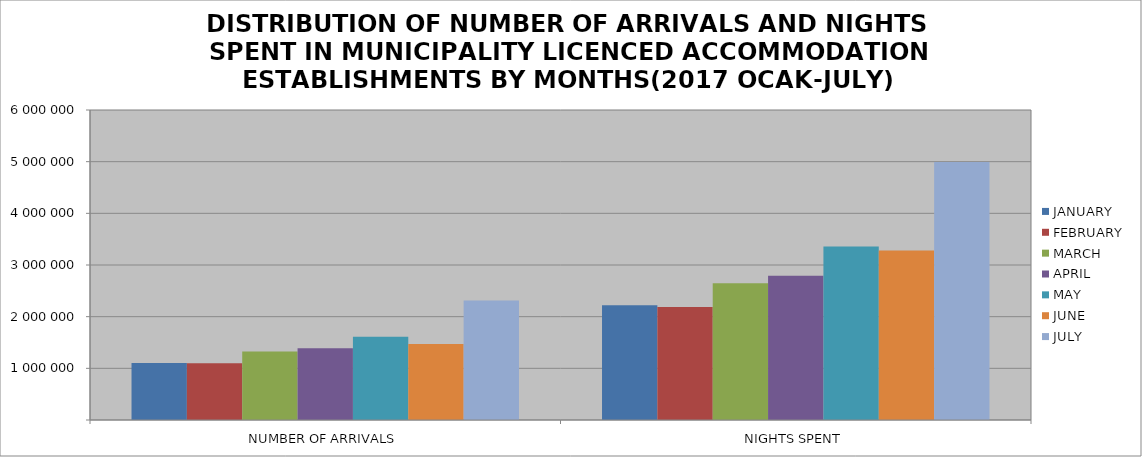
| Category | JANUARY | FEBRUARY | MARCH | APRIL | MAY | JUNE | JULY |
|---|---|---|---|---|---|---|---|
| NUMBER OF ARRIVALS | 1104649 | 1099366 | 1327993 | 1389075 | 1611959 | 1472053 | 2311504 |
| NIGHTS SPENT | 2222261 | 2187982 | 2645959 | 2791881 | 3355819 | 3280620 | 4994703 |